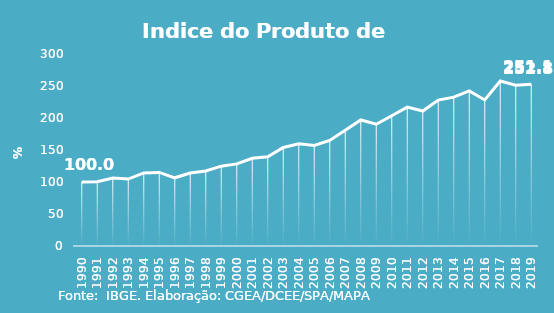
| Category | Indice de Prod. base 1990 |
|---|---|
| 1990.0 | 100 |
| 1991.0 | 100.275 |
| 1992.0 | 106.203 |
| 1993.0 | 104.57 |
| 1994.0 | 114.164 |
| 1995.0 | 115.024 |
| 1996.0 | 106.552 |
| 1997.0 | 114.037 |
| 1998.0 | 117.319 |
| 1999.0 | 124.734 |
| 2000.0 | 128.293 |
| 2001.0 | 136.975 |
| 2002.0 | 139.51 |
| 2003.0 | 153.868 |
| 2004.0 | 159.641 |
| 2005.0 | 157.136 |
| 2006.0 | 164.858 |
| 2007.0 | 180.781 |
| 2008.0 | 196.91 |
| 2009.0 | 190.309 |
| 2010.0 | 203.581 |
| 2011.0 | 217.041 |
| 2012.0 | 210.932 |
| 2013.0 | 228.009 |
| 2014.0 | 232.562 |
| 2015.0 | 242.318 |
| 2016.0 | 228.239 |
| 2017.0 | 257.766 |
| 2018.0 | 251.095 |
| 2019.0 | 252.819 |